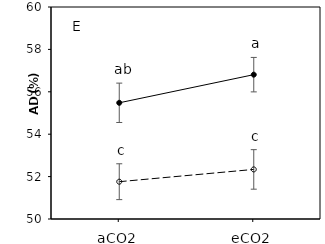
| Category | Bt | Xy |
|---|---|---|
| aCO2 | 55.481 | 51.76 |
| eCO2 | 56.808 | 52.339 |